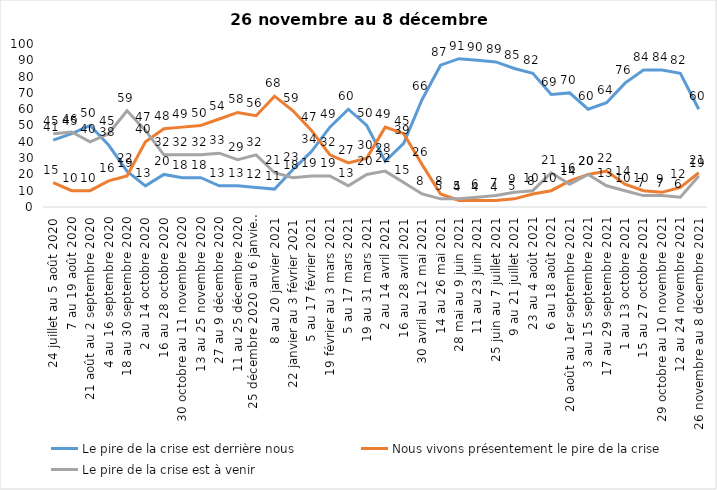
| Category | Le pire de la crise est derrière nous | Nous vivons présentement le pire de la crise | Le pire de la crise est à venir |
|---|---|---|---|
| 24 juillet au 5 août 2020 | 41 | 15 | 45 |
| 7 au 19 août 2020 | 45 | 10 | 46 |
| 21 août au 2 septembre 2020 | 50 | 10 | 40 |
| 4 au 16 septembre 2020 | 38 | 16 | 45 |
| 18 au 30 septembre 2020 | 22 | 19 | 59 |
| 2 au 14 octobre 2020 | 13 | 40 | 47 |
| 16 au 28 octobre 2020 | 20 | 48 | 32 |
| 30 octobre au 11 novembre 2020 | 18 | 49 | 32 |
| 13 au 25 novembre 2020 | 18 | 50 | 32 |
| 27 au 9 décembre 2020 | 13 | 54 | 33 |
| 11 au 25 décembre 2020 | 13 | 58 | 29 |
| 25 décembre 2020 au 6 janvier 2021 | 12 | 56 | 32 |
| 8 au 20 janvier 2021 | 11 | 68 | 21 |
| 22 janvier au 3 février 2021 | 23 | 59 | 18 |
| 5 au 17 février 2021 | 34 | 47 | 19 |
| 19 février au 3 mars 2021 | 49 | 32 | 19 |
| 5 au 17 mars 2021 | 60 | 27 | 13 |
| 19 au 31 mars 2021 | 50 | 30 | 20 |
| 2 au 14 avril 2021 | 28 | 49 | 22 |
| 16 au 28 avril 2021 | 39 | 45 | 15 |
| 30 avril au 12 mai 2021 | 66 | 26 | 8 |
| 14 au 26 mai 2021 | 87 | 8 | 5 |
| 28 mai au 9 juin 2021 | 91 | 4 | 5 |
| 11 au 23 juin 2021 | 90 | 4 | 6 |
| 25 juin au 7 juillet 2021 | 89 | 4 | 7 |
| 9 au 21 juillet 2021 | 85 | 5 | 9 |
| 23 au 4 août 2021 | 82 | 8 | 10 |
| 6 au 18 août 2021 | 69 | 10 | 21 |
| 20 août au 1er septembre 2021 | 70 | 16 | 14 |
| 3 au 15 septembre 2021 | 60 | 20 | 20 |
| 17 au 29 septembre 2021 | 64 | 22 | 13 |
| 1 au 13 octobre 2021 | 76 | 14 | 10 |
| 15 au 27 octobre 2021 | 84 | 10 | 7 |
| 29 octobre au 10 novembre 2021 | 84 | 9 | 7 |
| 12 au 24 novembre 2021 | 82 | 12 | 6 |
| 26 novembre au 8 décembre 2021 | 60 | 21 | 19 |